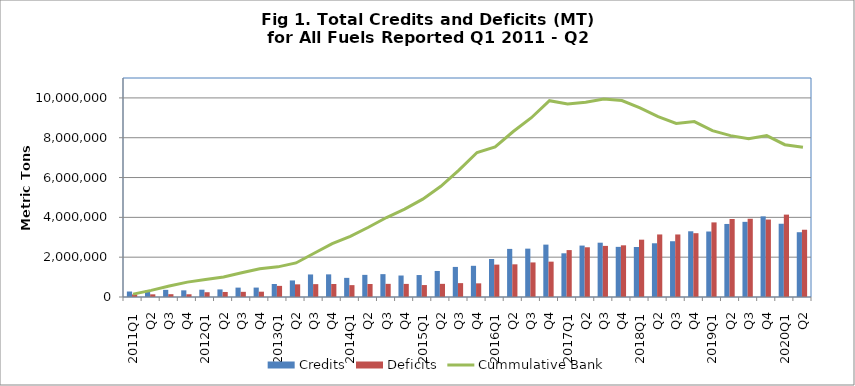
| Category | Credits | Deficits |
|---|---|---|
| 2011Q1 | 275639 | 132283 |
| Q2 | 325071 | 134760 |
| Q3 | 358817 | 141381 |
| Q4 | 334451 | 137396 |
| 2012Q1 | 366391 | 240260 |
| Q2 | 380783 | 252750 |
| Q3 | 471290 | 259582 |
| Q4 | 473045 | 266666 |
| 2013Q1 | 652535 | 558804 |
| Q2 | 832199 | 636140 |
| Q3 | 1132141 | 646613 |
| Q4 | 1137322 | 653565 |
| 2014Q1 | 961263 | 596240 |
| Q2 | 1111616 | 653122 |
| Q3 | 1148264 | 660254 |
| Q4 | 1079148 | 657732 |
| 2015Q1 | 1102924 | 600144 |
| Q2 | 1307672 | 660642 |
| Q3 | 1510754 | 696772 |
| Q4 | 1566898 | 686210 |
| 2016Q1 | 1907907 | 1627195 |
| Q2 | 2416121 | 1641557 |
| Q3 | 2428897 | 1736480 |
| Q4 | 2631117 | 1775489 |
| 2017Q1 | 2195244 | 2356219 |
| Q2 | 2582576 | 2497783 |
| Q3 | 2727782 | 2566731 |
| Q4 | 2518172 | 2595941 |
| 2018Q1 | 2510703 | 2879229 |
| Q2 | 2698412 | 3141737 |
| Q3 | 2801498 | 3140867 |
| Q4 | 3300906 | 3204670 |
| 2019Q1 | 3289327 | 3747363 |
| Q2 | 3668996 | 3918803 |
| Q3 | 3774817 | 3929777 |
| Q4 | 4050151 | 3891101 |
| 2020Q1 | 3679498 | 4138102 |
| Q2 | 3254267 | 3378334 |